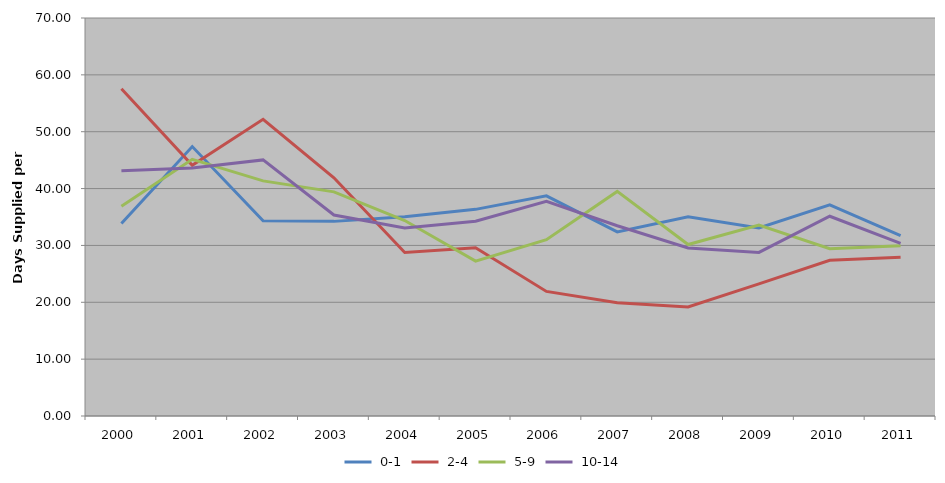
| Category |  0-1 |  2-4 |  5-9 |  10-14 |
|---|---|---|---|---|
| 2000 | 33.867 | 57.553 | 36.905 | 43.152 |
| 2001 | 47.387 | 44.094 | 45.138 | 43.634 |
| 2002 | 34.35 | 52.188 | 41.348 | 45.04 |
| 2003 | 34.231 | 41.897 | 39.426 | 35.352 |
| 2004 | 35.041 | 28.743 | 34.383 | 33.072 |
| 2005 | 36.343 | 29.602 | 27.237 | 34.25 |
| 2006 | 38.72 | 21.907 | 31 | 37.747 |
| 2007 | 32.377 | 19.924 | 39.502 | 33.463 |
| 2008 | 35.028 | 19.193 | 30.161 | 29.538 |
| 2009 | 33.086 | 23.242 | 33.586 | 28.776 |
| 2010 | 37.15 | 27.394 | 29.434 | 35.136 |
| 2011 | 31.706 | 27.918 | 29.939 | 30.356 |